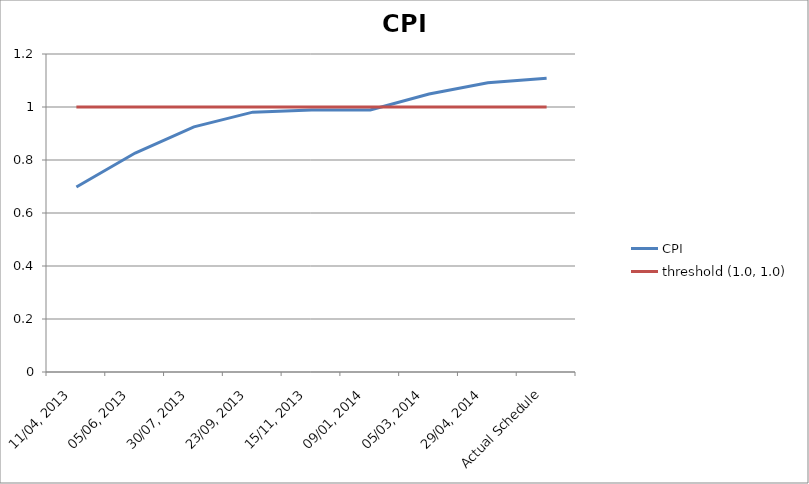
| Category | CPI | threshold (1.0, 1.0) |
|---|---|---|
| 11/04, 2013 | 0.698 | 1 |
| 05/06, 2013 | 0.826 | 1 |
| 30/07, 2013 | 0.925 | 1 |
| 23/09, 2013 | 0.981 | 1 |
| 15/11, 2013 | 0.989 | 1 |
| 09/01, 2014 | 0.989 | 1 |
| 05/03, 2014 | 1.049 | 1 |
| 29/04, 2014 | 1.091 | 1 |
| Actual Schedule | 1.108 | 1 |